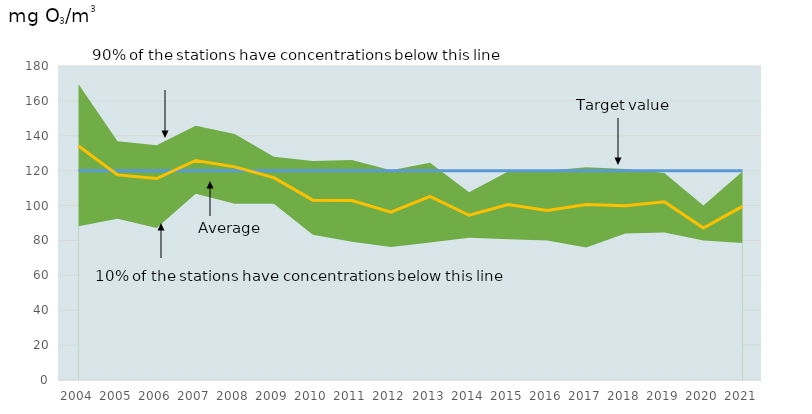
| Category | LV | average |
|---|---|---|
| 2004.0 | 120 | 134.1 |
| 2005.0 | 120 | 117.583 |
| 2006.0 | 120 | 115.5 |
| 2007.0 | 120 | 125.833 |
| 2008.0 | 120 | 122.182 |
| 2009.0 | 120 | 116 |
| 2010.0 | 120 | 103.1 |
| 2011.0 | 120 | 102.9 |
| 2012.0 | 120 | 96.222 |
| 2013.0 | 120 | 105.222 |
| 2014.0 | 120 | 94.429 |
| 2015.0 | 120 | 100.6 |
| 2016.0 | 120 | 97.182 |
| 2017.0 | 120 | 100.545 |
| 2018.0 | 120 | 99.909 |
| 2019.0 | 120 | 102.167 |
| 2020.0 | 120 | 87.091 |
| 2021.0 | 120 | 99.5 |